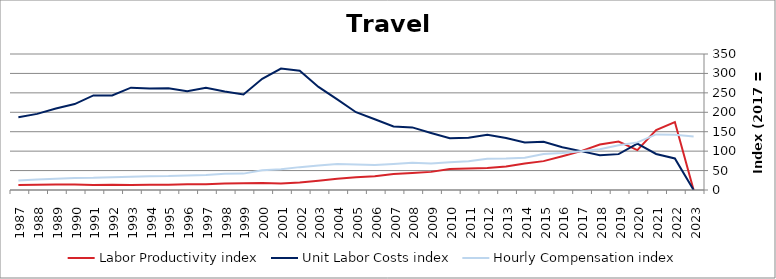
| Category | Labor Productivity index | Unit Labor Costs index | Hourly Compensation index |
|---|---|---|---|
| 2023.0 | 0 | 0 | 137.497 |
| 2022.0 | 174.972 | 81.136 | 141.965 |
| 2021.0 | 154.314 | 92.717 | 143.076 |
| 2020.0 | 102.556 | 119.504 | 122.559 |
| 2019.0 | 124.546 | 92.301 | 114.957 |
| 2018.0 | 116.863 | 89.554 | 104.655 |
| 2017.0 | 100 | 100 | 100 |
| 2016.0 | 86.654 | 110.162 | 95.459 |
| 2015.0 | 74.313 | 124.361 | 92.416 |
| 2014.0 | 68.007 | 122.462 | 83.283 |
| 2013.0 | 60.385 | 133.856 | 80.829 |
| 2012.0 | 56.639 | 141.872 | 80.355 |
| 2011.0 | 55.178 | 134.489 | 74.208 |
| 2010.0 | 53.801 | 132.985 | 71.548 |
| 2009.0 | 46.648 | 146.785 | 68.472 |
| 2008.0 | 43.553 | 161.097 | 70.162 |
| 2007.0 | 41.011 | 163.347 | 66.99 |
| 2006.0 | 35.264 | 181.962 | 64.166 |
| 2005.0 | 32.759 | 200.146 | 65.566 |
| 2004.0 | 28.683 | 233.259 | 66.906 |
| 2003.0 | 23.819 | 265.314 | 63.194 |
| 2002.0 | 19.163 | 307.123 | 58.854 |
| 2001.0 | 17.029 | 312.673 | 53.246 |
| 2000.0 | 17.793 | 286.156 | 50.916 |
| 1999.0 | 17.153 | 245.763 | 42.157 |
| 1998.0 | 16.468 | 253.318 | 41.717 |
| 1997.0 | 14.724 | 263.152 | 38.747 |
| 1996.0 | 14.744 | 254.09 | 37.464 |
| 1995.0 | 13.695 | 262.098 | 35.894 |
| 1994.0 | 13.582 | 261.369 | 35.5 |
| 1993.0 | 13 | 263.288 | 34.227 |
| 1992.0 | 13.594 | 243.261 | 33.068 |
| 1991.0 | 12.836 | 243.448 | 31.249 |
| 1990.0 | 13.891 | 221.207 | 30.728 |
| 1989.0 | 13.93 | 209.729 | 29.215 |
| 1988.0 | 13.702 | 195.854 | 26.836 |
| 1987.0 | 13.121 | 187.402 | 24.59 |